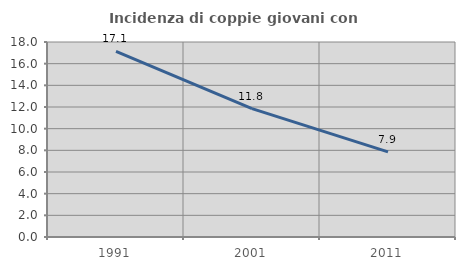
| Category | Incidenza di coppie giovani con figli |
|---|---|
| 1991.0 | 17.135 |
| 2001.0 | 11.849 |
| 2011.0 | 7.862 |